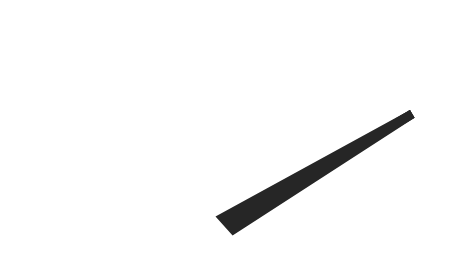
| Category | y |
|---|---|
| 90.39838832047744 | 29.461 |
| 51.17845337360995 | -1.616 |
| 48.82154662639005 | 1.616 |
| 90.39838832047744 | 29.461 |
| 50.0 | 0 |